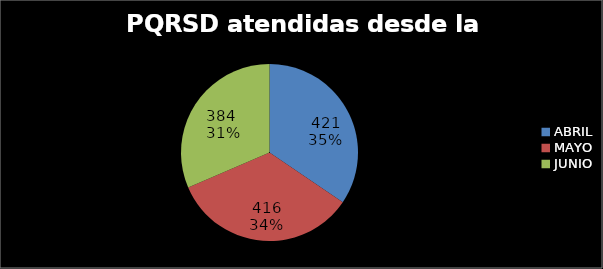
| Category |  PQRSD atendidas desde la UAC |
|---|---|
| ABRIL | 421 |
| MAYO | 416 |
| JUNIO | 384 |